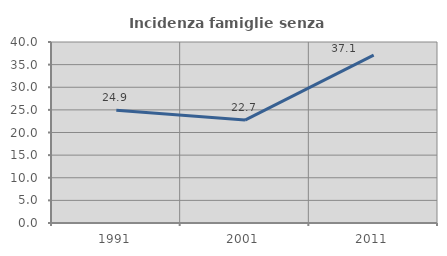
| Category | Incidenza famiglie senza nuclei |
|---|---|
| 1991.0 | 24.92 |
| 2001.0 | 22.74 |
| 2011.0 | 37.117 |